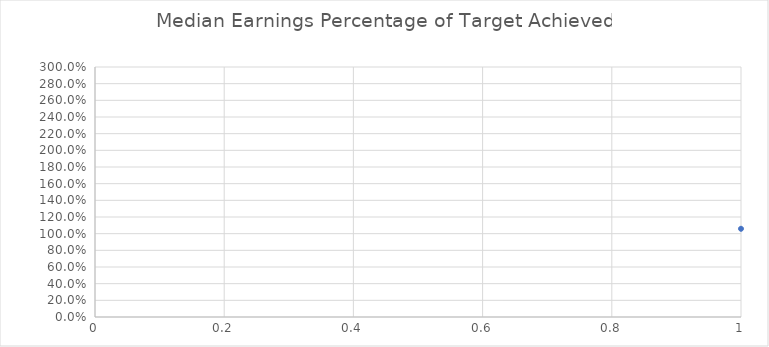
| Category | Series 0 |
|---|---|
| 0 | 1.059 |
| 1 | 0.85 |
| 2 | 1.12 |
| 3 | 0.832 |
| 4 | 1.02 |
| 5 | 0.93 |
| 6 | 0 |
| 7 | 0.799 |
| 8 | 1.123 |
| 9 | 1.058 |
| 10 | 0.927 |
| 11 | 1.151 |
| 12 | 0 |
| 13 | 0 |
| 14 | 0.84 |
| 15 | 0.882 |
| 16 | 0.943 |
| 17 | 1.071 |
| 18 | 1.181 |
| 19 | 1.373 |
| 20 | 1.083 |
| 21 | 1.485 |
| 22 | 1.367 |
| 23 | 0.476 |
| 24 | 1.449 |
| 25 | 1.667 |
| 26 | 1.372 |
| 27 | 2.173 |
| 28 | 1.034 |
| 29 | 1.102 |
| 30 | 0.359 |
| 31 | 1.057 |
| 32 | 0.982 |
| 33 | 1.267 |
| 34 | 0 |
| 35 | 0.785 |
| 36 | 0.278 |
| 37 | 0.818 |
| 38 | 1.622 |
| 39 | 0.748 |
| 40 | 0 |
| 41 | 1.189 |
| 42 | 0.004 |
| 43 | 1.149 |
| 44 | 1.105 |
| 45 | 0.127 |
| 46 | 1.517 |
| 47 | 1.089 |
| 48 | 1.08 |
| 49 | 0 |
| 50 | 0 |
| 51 | 1.085 |
| 52 | 0.951 |
| 53 | 0.892 |
| 54 | 1.218 |
| 55 | 0 |
| 56 | 1.219 |
| 57 | 0.911 |
| 58 | 0.918 |
| 59 | 0 |
| 60 | 1.244 |
| 61 | 0 |
| 62 | 0.775 |
| 63 | 1.652 |
| 64 | 1.117 |
| 65 | 0.961 |
| 66 | 1.875 |
| 67 | 1.983 |
| 68 | 1.113 |
| 69 | 1.69 |
| 70 | 0.795 |
| 71 | 1.978 |
| 72 | 0 |
| 73 | 0 |
| 74 | 0.004 |
| 75 | 0 |
| 76 | 2.811 |